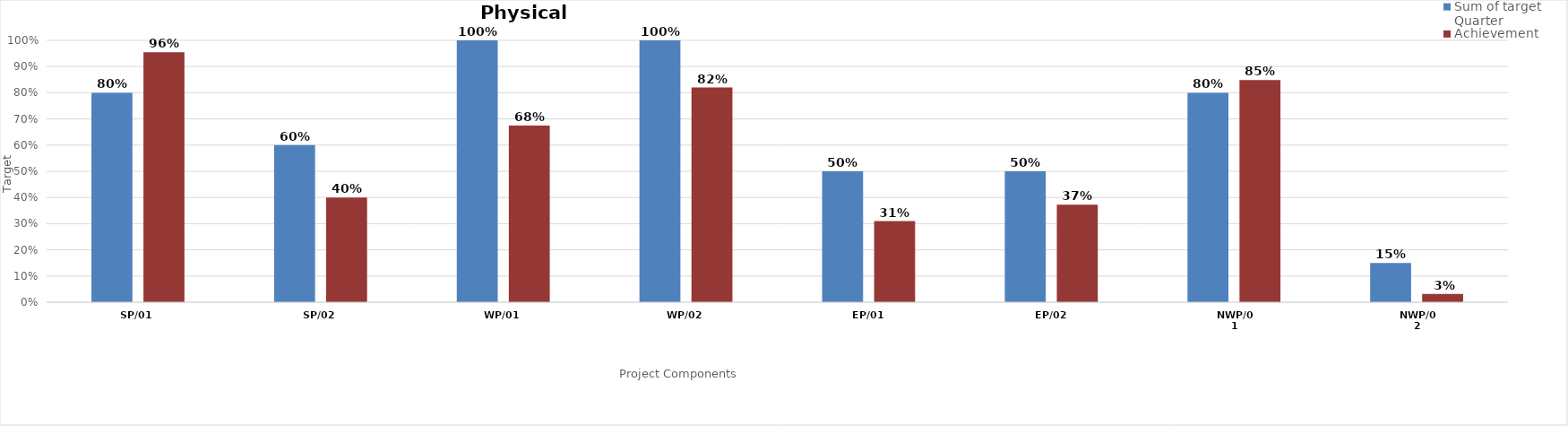
| Category | Sum of target Quarter | Achievement |
|---|---|---|
| SP/01 | 0.8 | 0.955 |
| SP/02 | 0.6 | 0.4 |
| WP/01 | 1 | 0.675 |
| WP/02 | 1 | 0.82 |
| EP/01 | 0.5 | 0.31 |
| EP/02 | 0.5 | 0.372 |
| NWP/01 | 0.8 | 0.848 |
| NWP/02 | 0.15 | 0.032 |